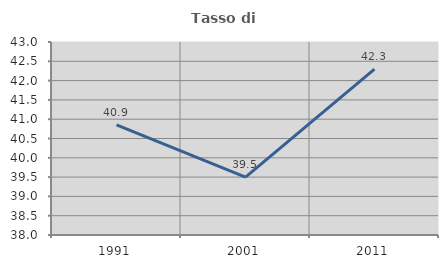
| Category | Tasso di occupazione   |
|---|---|
| 1991.0 | 40.85 |
| 2001.0 | 39.501 |
| 2011.0 | 42.299 |